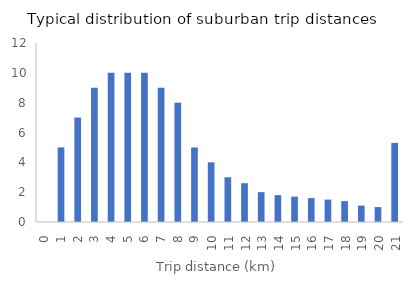
| Category | Proportion of trips |
|---|---|
| 0.0 | 0 |
| 1.0 | 5 |
| 2.0 | 7 |
| 3.0 | 9 |
| 4.0 | 10 |
| 5.0 | 10 |
| 6.0 | 10 |
| 7.0 | 9 |
| 8.0 | 8 |
| 9.0 | 5 |
| 10.0 | 4 |
| 11.0 | 3 |
| 12.0 | 2.6 |
| 13.0 | 2 |
| 14.0 | 1.8 |
| 15.0 | 1.7 |
| 16.0 | 1.6 |
| 17.0 | 1.5 |
| 18.0 | 1.4 |
| 19.0 | 1.1 |
| 20.0 | 1 |
| 21.0 | 5.3 |